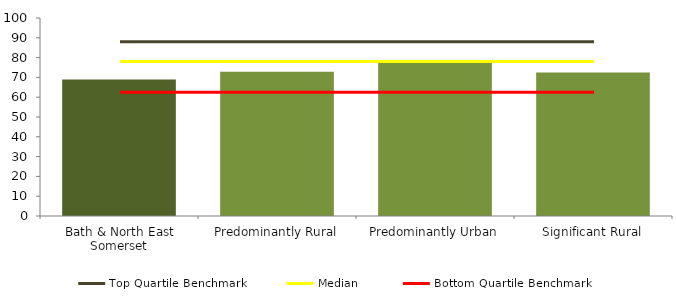
| Category | Series 0 |
|---|---|
| Bath & North East Somerset | 69 |
| Predominantly Rural | 72.8 |
| Predominantly Urban | 78.027 |
| Significant Rural | 72.5 |